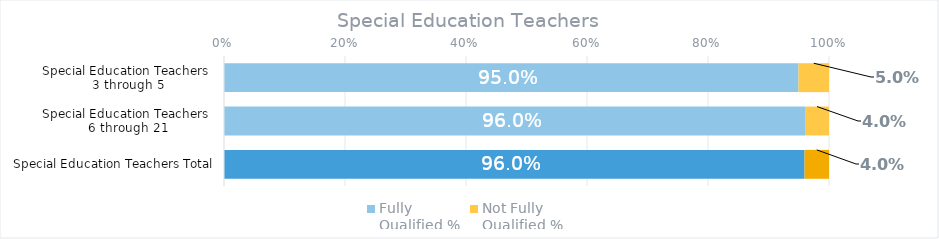
| Category | Fully
Qualified % | Not Fully 
Qualified %  |
|---|---|---|
| Special Education Teachers 
3 through 5 | 0.95 | 0.05 |
| Special Education Teachers 
6 through 21 | 0.96 | 0.04 |
| Special Education Teachers Total | 0.96 | 0.04 |